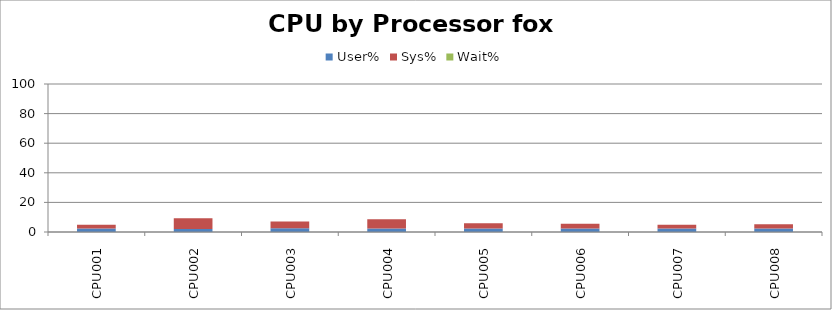
| Category | User% | Sys% | Wait% |
|---|---|---|---|
| CPU001 | 2.328 | 2.588 | 0.065 |
| CPU002 | 1.995 | 7.257 | 0.06 |
| CPU003 | 2.57 | 4.54 | 0.007 |
| CPU004 | 2.342 | 6.237 | 0.068 |
| CPU005 | 2.382 | 3.482 | 0.075 |
| CPU006 | 2.328 | 3.19 | 0.013 |
| CPU007 | 2.287 | 2.623 | 0.008 |
| CPU008 | 2.352 | 2.823 | 0.002 |